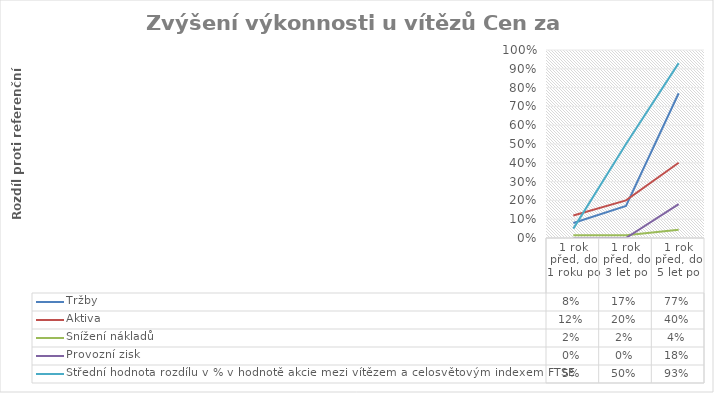
| Category | Tržby | Aktiva | Snížení nákladů | Provozní zisk | Střední hodnota rozdílu v % v hodnotě akcie mezi vítězem a celosvětovým indexem FTSE |
|---|---|---|---|---|---|
| 1 rok před, do 1 roku po | 0.08 | 0.12 | 0.015 | 0 | 0.05 |
| 1 rok před, do 3 let po | 0.17 | 0.2 | 0.015 | 0 | 0.5 |
| 1 rok před, do 5 let po | 0.77 | 0.4 | 0.044 | 0.18 | 0.93 |